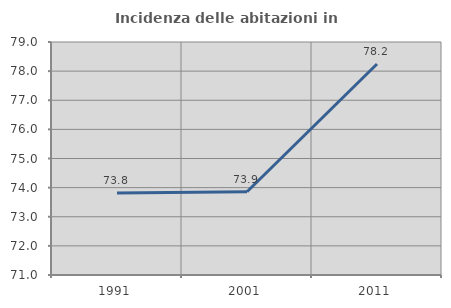
| Category | Incidenza delle abitazioni in proprietà  |
|---|---|
| 1991.0 | 73.819 |
| 2001.0 | 73.857 |
| 2011.0 | 78.246 |